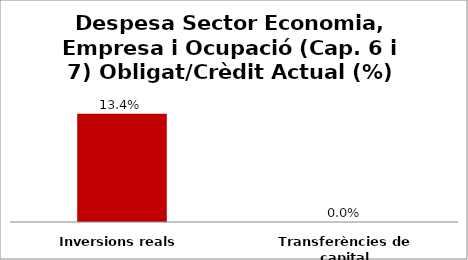
| Category | Series 0 |
|---|---|
| Inversions reals | 0.134 |
| Transferències de capital | 0 |